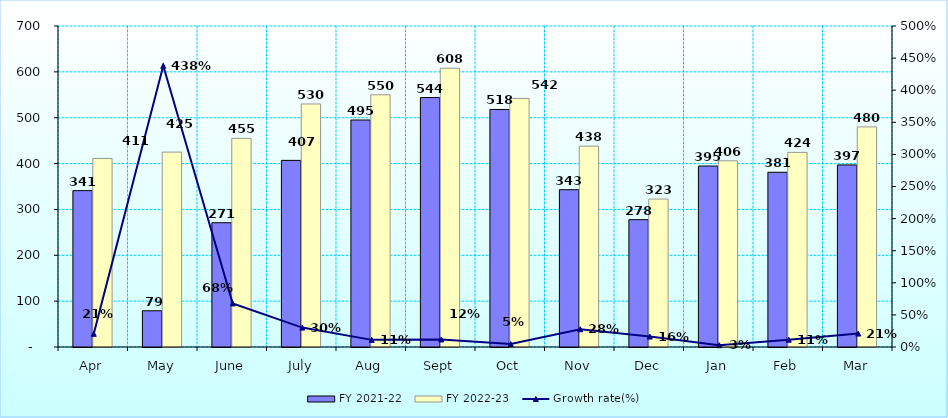
| Category | FY 2021-22 | FY 2022-23 |
|---|---|---|
| Apr | 341 | 411 |
| May | 79 | 425 |
| June | 271 | 455 |
| July | 407 | 530 |
| Aug | 495 | 550 |
| Sept | 544 | 608 |
| Oct | 518 | 542 |
| Nov | 343 | 438 |
| Dec | 277.688 | 322.644 |
| Jan | 394.668 | 406 |
| Feb | 381.052 | 424.432 |
| Mar | 397 | 480 |